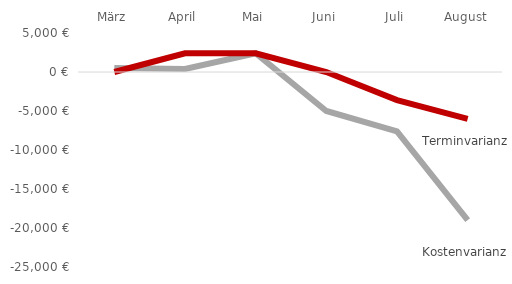
| Category | Kostenvarianz | Terminvarianz |
|---|---|---|
| März | 500 | 0 |
| April | 400 | 2400 |
| Mai | 2400 | 2400 |
| Juni | -5000 | 0 |
| Juli | -7600 | -3600 |
| August | -19000 | -6000 |